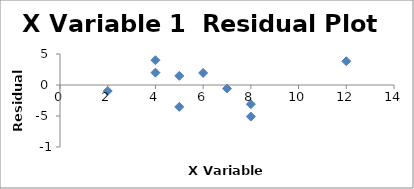
| Category | Series 0 |
|---|---|
| 2.0 | -0.966 |
| 4.0 | 1.993 |
| 4.0 | 3.993 |
| 5.0 | 1.472 |
| 5.0 | -3.528 |
| 6.0 | 1.952 |
| 7.0 | -0.568 |
| 8.0 | -5.089 |
| 8.0 | -3.089 |
| 12.0 | 3.829 |